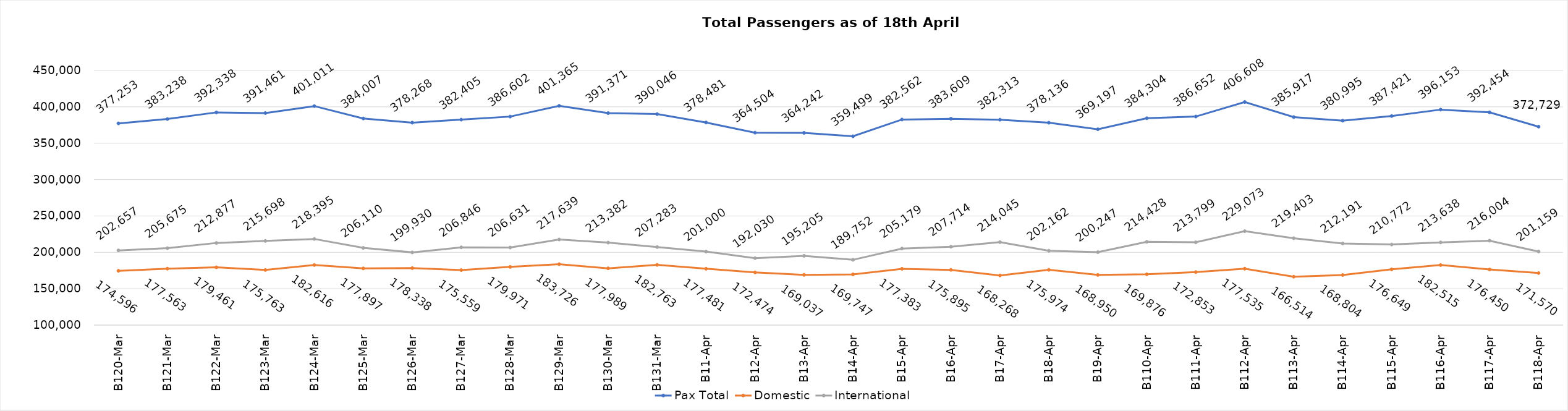
| Category | Pax Total | Domestic | International |
|---|---|---|---|
| 2024-03-20 | 377253 | 174596 | 202657 |
| 2024-03-21 | 383238 | 177563 | 205675 |
| 2024-03-22 | 392338 | 179461 | 212877 |
| 2024-03-23 | 391461 | 175763 | 215698 |
| 2024-03-24 | 401011 | 182616 | 218395 |
| 2024-03-25 | 384007 | 177897 | 206110 |
| 2024-03-26 | 378268 | 178338 | 199930 |
| 2024-03-27 | 382405 | 175559 | 206846 |
| 2024-03-28 | 386602 | 179971 | 206631 |
| 2024-03-29 | 401365 | 183726 | 217639 |
| 2024-03-30 | 391371 | 177989 | 213382 |
| 2024-03-31 | 390046 | 182763 | 207283 |
| 2024-04-01 | 378481 | 177481 | 201000 |
| 2024-04-02 | 364504 | 172474 | 192030 |
| 2024-04-03 | 364242 | 169037 | 195205 |
| 2024-04-04 | 359499 | 169747 | 189752 |
| 2024-04-05 | 382562 | 177383 | 205179 |
| 2024-04-06 | 383609 | 175895 | 207714 |
| 2024-04-07 | 382313 | 168268 | 214045 |
| 2024-04-08 | 378136 | 175974 | 202162 |
| 2024-04-09 | 369197 | 168950 | 200247 |
| 2024-04-10 | 384304 | 169876 | 214428 |
| 2024-04-11 | 386652 | 172853 | 213799 |
| 2024-04-12 | 406608 | 177535 | 229073 |
| 2024-04-13 | 385917 | 166514 | 219403 |
| 2024-04-14 | 380995 | 168804 | 212191 |
| 2024-04-15 | 387421 | 176649 | 210772 |
| 2024-04-16 | 396153 | 182515 | 213638 |
| 2024-04-17 | 392454 | 176450 | 216004 |
| 2024-04-18 | 372729 | 171570 | 201159 |